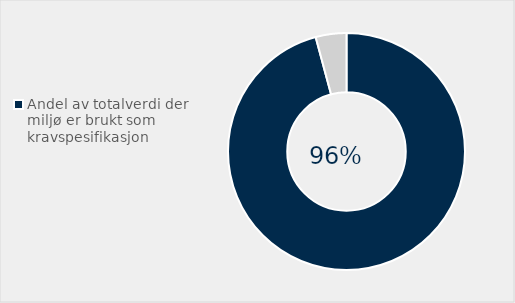
| Category | Series 0 |
|---|---|
| Andel av totalverdi der miljø er brukt som kravspesifikasjon | 0.958 |
| Ikke brukt miljø som kravspesifikasjon | 0.042 |